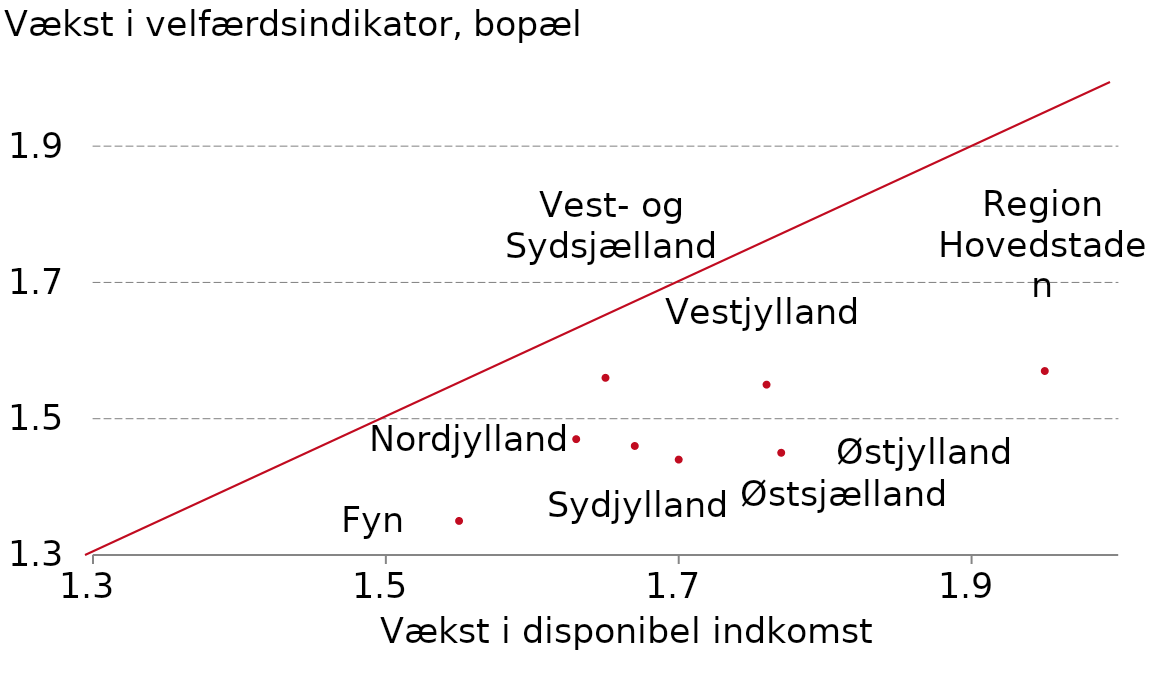
| Category |  Serie1 |
|---|---|
| 1.55 | 1.35 |
| 1.63 | 1.47 |
| 1.95 | 1.57 |
| 1.67 | 1.46 |
| 1.65 | 1.56 |
| 1.76 | 1.55 |
| 1.77 | 1.45 |
| 1.7 | 1.44 |